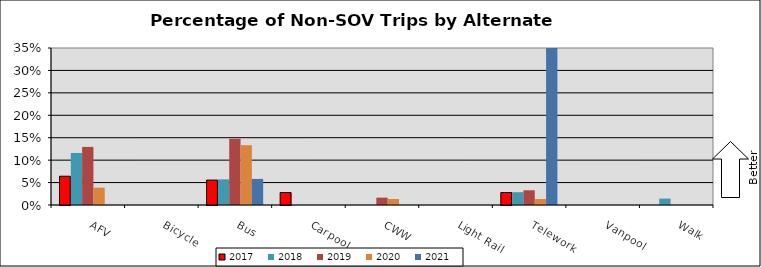
| Category | 2017 | 2018 | 2019 | 2020 | 2021 |
|---|---|---|---|---|---|
| AFV | 0.064 | 0.116 | 0.13 | 0.039 | 0 |
| Bicycle | 0 | 0 | 0 | 0 | 0 |
| Bus | 0.056 | 0.057 | 0.148 | 0.133 | 0.058 |
| Carpool | 0.028 | 0 | 0 | 0 | 0 |
| CWW | 0 | 0 | 0.016 | 0.013 | 0 |
| Light Rail | 0 | 0 | 0 | 0 | 0 |
| Telework | 0.028 | 0.029 | 0.033 | 0.013 | 0.593 |
| Vanpool | 0 | 0 | 0 | 0 | 0 |
| Walk | 0 | 0.014 | 0 | 0 | 0 |